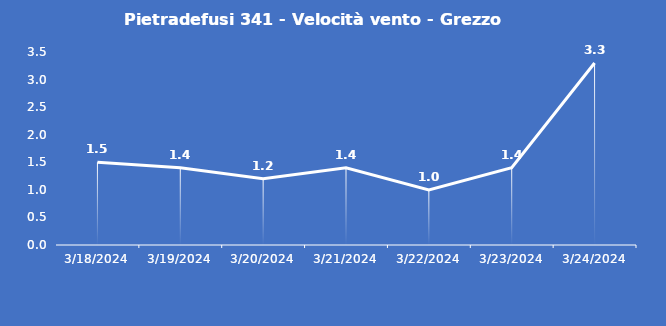
| Category | Pietradefusi 341 - Velocità vento - Grezzo (m/s) |
|---|---|
| 3/18/24 | 1.5 |
| 3/19/24 | 1.4 |
| 3/20/24 | 1.2 |
| 3/21/24 | 1.4 |
| 3/22/24 | 1 |
| 3/23/24 | 1.4 |
| 3/24/24 | 3.3 |